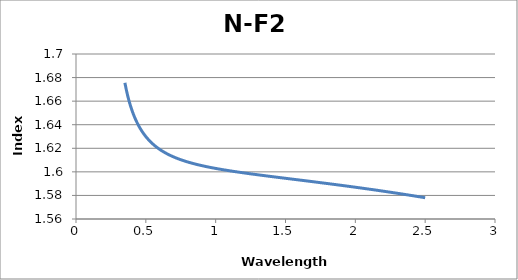
| Category | N-F2 |
|---|---|
| 0.35 | 1.676 |
| 0.36 | 1.67 |
| 0.37 | 1.665 |
| 0.38 | 1.66 |
| 0.39 | 1.656 |
| 0.4 | 1.652 |
| 0.41 | 1.649 |
| 0.42 | 1.646 |
| 0.43 | 1.644 |
| 0.44 | 1.641 |
| 0.45 | 1.639 |
| 0.46 | 1.637 |
| 0.47 | 1.635 |
| 0.48 | 1.633 |
| 0.49 | 1.631 |
| 0.5 | 1.63 |
| 0.51 | 1.629 |
| 0.52 | 1.627 |
| 0.53 | 1.626 |
| 0.54 | 1.625 |
| 0.55 | 1.624 |
| 0.56 | 1.623 |
| 0.57 | 1.622 |
| 0.58 | 1.621 |
| 0.59 | 1.62 |
| 0.6 | 1.619 |
| 0.61 | 1.618 |
| 0.62 | 1.617 |
| 0.63 | 1.617 |
| 0.64 | 1.616 |
| 0.65 | 1.615 |
| 0.66 | 1.615 |
| 0.67 | 1.614 |
| 0.68 | 1.614 |
| 0.69 | 1.613 |
| 0.7 | 1.613 |
| 0.71 | 1.612 |
| 0.72 | 1.612 |
| 0.73 | 1.611 |
| 0.74 | 1.611 |
| 0.75 | 1.61 |
| 0.76 | 1.61 |
| 0.77 | 1.61 |
| 0.78 | 1.609 |
| 0.79 | 1.609 |
| 0.8 | 1.608 |
| 0.81 | 1.608 |
| 0.82 | 1.608 |
| 0.83 | 1.607 |
| 0.84 | 1.607 |
| 0.85 | 1.607 |
| 0.86 | 1.606 |
| 0.87 | 1.606 |
| 0.88 | 1.606 |
| 0.89 | 1.606 |
| 0.9 | 1.605 |
| 0.91 | 1.605 |
| 0.92 | 1.605 |
| 0.93 | 1.605 |
| 0.94 | 1.604 |
| 0.95 | 1.604 |
| 0.96 | 1.604 |
| 0.97 | 1.604 |
| 0.98 | 1.603 |
| 0.99 | 1.603 |
| 1.0 | 1.603 |
| 1.01 | 1.603 |
| 1.02 | 1.602 |
| 1.03 | 1.602 |
| 1.04 | 1.602 |
| 1.05 | 1.602 |
| 1.06 | 1.602 |
| 1.07 | 1.601 |
| 1.08 | 1.601 |
| 1.09 | 1.601 |
| 1.1 | 1.601 |
| 1.11 | 1.601 |
| 1.12 | 1.601 |
| 1.13 | 1.6 |
| 1.14 | 1.6 |
| 1.15 | 1.6 |
| 1.16 | 1.6 |
| 1.17 | 1.6 |
| 1.18 | 1.599 |
| 1.19 | 1.599 |
| 1.2 | 1.599 |
| 1.21 | 1.599 |
| 1.22 | 1.599 |
| 1.23 | 1.599 |
| 1.24 | 1.598 |
| 1.25 | 1.598 |
| 1.26 | 1.598 |
| 1.27 | 1.598 |
| 1.28 | 1.598 |
| 1.29 | 1.598 |
| 1.3 | 1.598 |
| 1.31 | 1.597 |
| 1.32 | 1.597 |
| 1.33 | 1.597 |
| 1.34 | 1.597 |
| 1.35 | 1.597 |
| 1.36 | 1.597 |
| 1.37 | 1.596 |
| 1.38 | 1.596 |
| 1.39 | 1.596 |
| 1.4 | 1.596 |
| 1.41 | 1.596 |
| 1.42 | 1.596 |
| 1.43 | 1.596 |
| 1.44 | 1.595 |
| 1.45 | 1.595 |
| 1.46 | 1.595 |
| 1.47 | 1.595 |
| 1.48 | 1.595 |
| 1.49 | 1.595 |
| 1.5 | 1.595 |
| 1.51 | 1.594 |
| 1.52 | 1.594 |
| 1.53 | 1.594 |
| 1.54 | 1.594 |
| 1.55 | 1.594 |
| 1.56 | 1.594 |
| 1.57 | 1.594 |
| 1.58 | 1.593 |
| 1.59 | 1.593 |
| 1.6 | 1.593 |
| 1.61 | 1.593 |
| 1.62 | 1.593 |
| 1.63 | 1.593 |
| 1.64 | 1.592 |
| 1.65 | 1.592 |
| 1.66 | 1.592 |
| 1.67 | 1.592 |
| 1.68 | 1.592 |
| 1.69 | 1.592 |
| 1.7 | 1.592 |
| 1.71 | 1.591 |
| 1.72 | 1.591 |
| 1.73 | 1.591 |
| 1.74 | 1.591 |
| 1.75 | 1.591 |
| 1.76 | 1.591 |
| 1.77 | 1.591 |
| 1.78 | 1.59 |
| 1.79 | 1.59 |
| 1.8 | 1.59 |
| 1.81 | 1.59 |
| 1.82 | 1.59 |
| 1.83 | 1.59 |
| 1.84 | 1.589 |
| 1.85 | 1.589 |
| 1.86 | 1.589 |
| 1.87 | 1.589 |
| 1.88 | 1.589 |
| 1.89 | 1.589 |
| 1.9 | 1.589 |
| 1.91 | 1.588 |
| 1.92 | 1.588 |
| 1.93 | 1.588 |
| 1.94 | 1.588 |
| 1.95 | 1.588 |
| 1.96 | 1.588 |
| 1.97 | 1.587 |
| 1.98 | 1.587 |
| 1.99 | 1.587 |
| 2.0 | 1.587 |
| 2.01 | 1.587 |
| 2.02 | 1.587 |
| 2.03 | 1.586 |
| 2.04 | 1.586 |
| 2.05 | 1.586 |
| 2.06 | 1.586 |
| 2.07 | 1.586 |
| 2.08 | 1.586 |
| 2.09 | 1.585 |
| 2.1 | 1.585 |
| 2.11 | 1.585 |
| 2.12 | 1.585 |
| 2.13 | 1.585 |
| 2.14 | 1.585 |
| 2.15 | 1.584 |
| 2.16 | 1.584 |
| 2.17 | 1.584 |
| 2.18 | 1.584 |
| 2.19 | 1.584 |
| 2.2 | 1.584 |
| 2.21 | 1.583 |
| 2.22 | 1.583 |
| 2.23 | 1.583 |
| 2.24 | 1.583 |
| 2.25 | 1.583 |
| 2.26 | 1.583 |
| 2.27 | 1.582 |
| 2.28 | 1.582 |
| 2.29 | 1.582 |
| 2.3 | 1.582 |
| 2.31 | 1.582 |
| 2.32 | 1.581 |
| 2.33 | 1.581 |
| 2.34 | 1.581 |
| 2.35 | 1.581 |
| 2.36 | 1.581 |
| 2.37 | 1.581 |
| 2.38 | 1.58 |
| 2.39 | 1.58 |
| 2.4 | 1.58 |
| 2.41 | 1.58 |
| 2.42 | 1.58 |
| 2.43 | 1.579 |
| 2.44 | 1.579 |
| 2.45 | 1.579 |
| 2.46 | 1.579 |
| 2.47 | 1.579 |
| 2.48 | 1.578 |
| 2.49 | 1.578 |
| 2.5 | 1.578 |